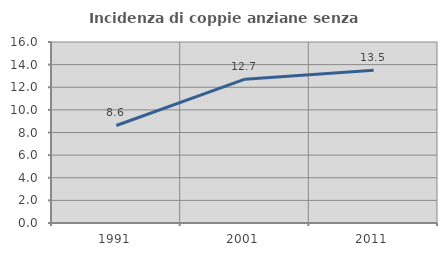
| Category | Incidenza di coppie anziane senza figli  |
|---|---|
| 1991.0 | 8.621 |
| 2001.0 | 12.711 |
| 2011.0 | 13.51 |